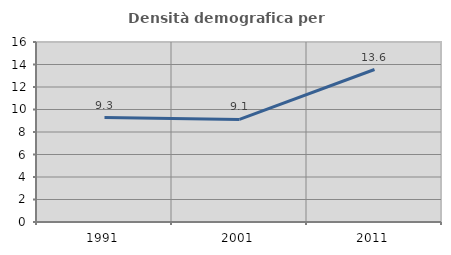
| Category | Densità demografica |
|---|---|
| 1991.0 | 9.287 |
| 2001.0 | 9.12 |
| 2011.0 | 13.555 |